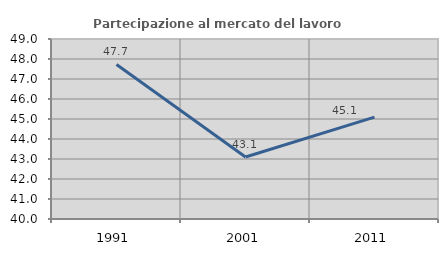
| Category | Partecipazione al mercato del lavoro  femminile |
|---|---|
| 1991.0 | 47.728 |
| 2001.0 | 43.097 |
| 2011.0 | 45.095 |